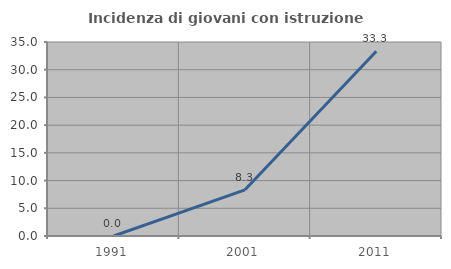
| Category | Incidenza di giovani con istruzione universitaria |
|---|---|
| 1991.0 | 0 |
| 2001.0 | 8.333 |
| 2011.0 | 33.333 |